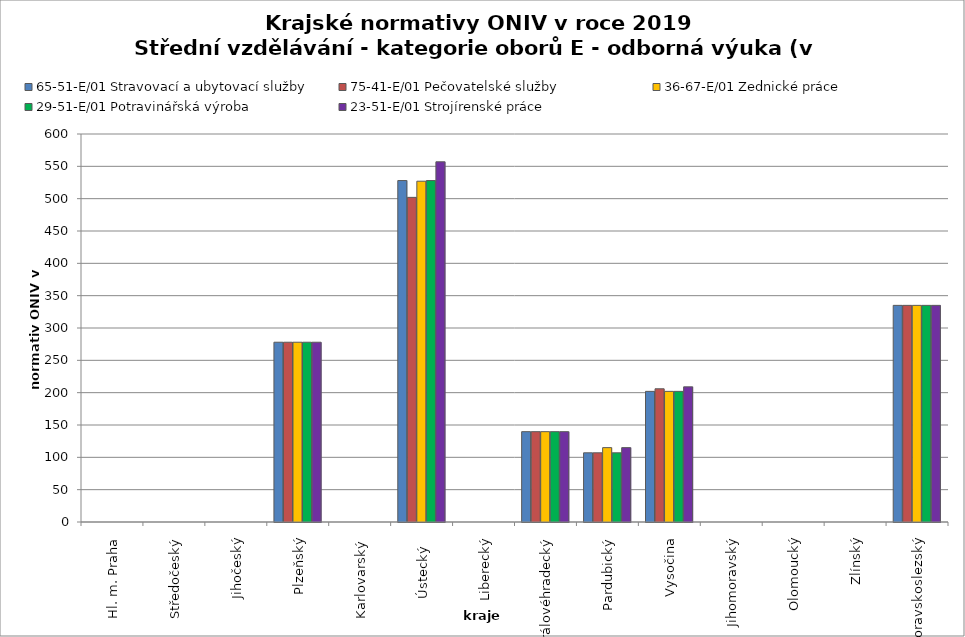
| Category | 65-51-E/01 Stravovací a ubytovací služby | 75-41-E/01 Pečovatelské služby | 36-67-E/01 Zednické práce | 29-51-E/01 Potravinářská výroba | 23-51-E/01 Strojírenské práce |
|---|---|---|---|---|---|
| Hl. m. Praha | 0 | 0 | 0 | 0 | 0 |
| Středočeský | 0 | 0 | 0 | 0 | 0 |
| Jihočeský | 0 | 0 | 0 | 0 | 0 |
| Plzeňský | 278 | 278 | 278 | 278 | 278 |
| Karlovarský  | 0 | 0 | 0 | 0 | 0 |
| Ústecký   | 528 | 502 | 527 | 528 | 557 |
| Liberecký | 0 | 0 | 0 | 0 | 0 |
| Královéhradecký | 139.7 | 139.7 | 139.7 | 139.7 | 139.7 |
| Pardubický | 107 | 107 | 115 | 107 | 115 |
| Vysočina | 202 | 206 | 202 | 202 | 209 |
| Jihomoravský | 0 | 0 | 0 | 0 | 0 |
| Olomoucký | 0 | 0 | 0 | 0 | 0 |
| Zlínský | 0 | 0 | 0 | 0 | 0 |
| Moravskoslezský | 335 | 335 | 335 | 335 | 335 |